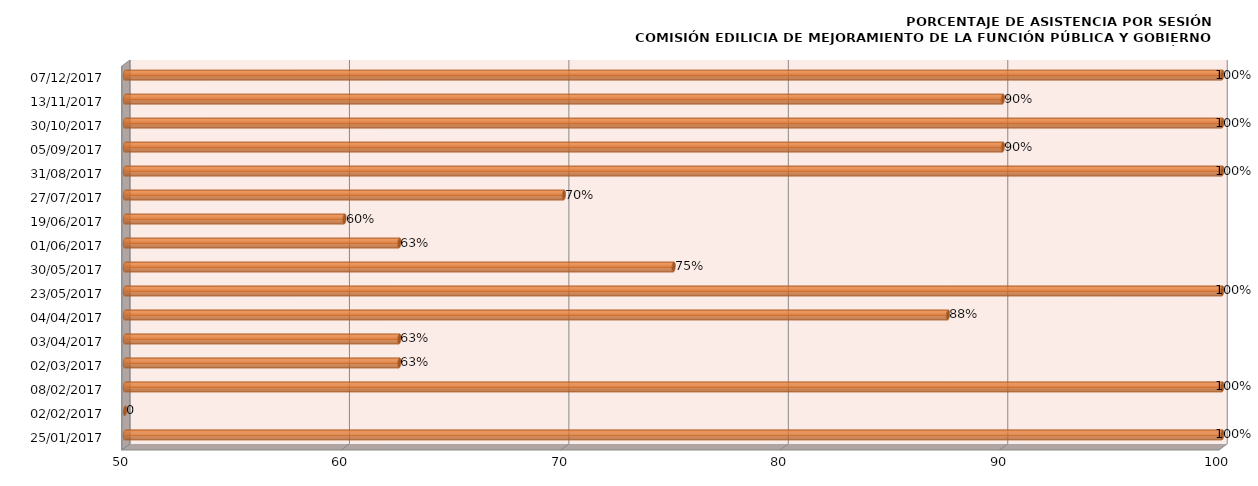
| Category | Series 0 |
|---|---|
| 25/01/2017 | 100 |
| 02/02/2017 | 0 |
| 08/02/2017 | 100 |
| 02/03/2017 | 62.5 |
| 03/04/2017 | 62.5 |
| 04/04/2017 | 87.5 |
| 23/05/2017 | 100 |
| 30/05/2017 | 75 |
| 01/06/2017 | 62.5 |
| 19/06/2017 | 60 |
| 27/07/2017 | 70 |
| 31/08/2017 | 100 |
| 05/09/2017 | 90 |
| 30/10/2017 | 100 |
| 13/11/2017 | 90 |
| 07/12/2017 | 100 |